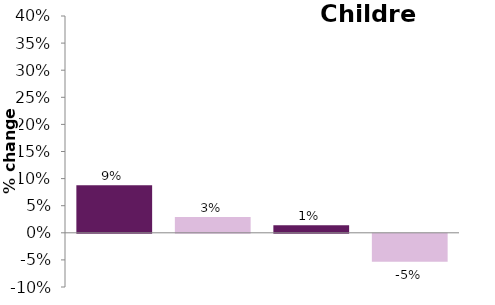
| Category | Children |
|---|---|
| 0 | 0.088 |
| 1 | 0.029 |
| 2 | 0.014 |
| 3 | -0.052 |